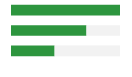
| Category | Series 0 | Series 1 |
|---|---|---|
| 0 | 1 | 0 |
| 1 | 0.692 | 0.308 |
| 2 | 0.4 | 0.6 |